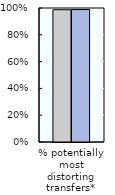
| Category | 2000-02 | 2018-20 |
|---|---|---|
| % potentially most distorting transfers* | 0.987 | 0.988 |